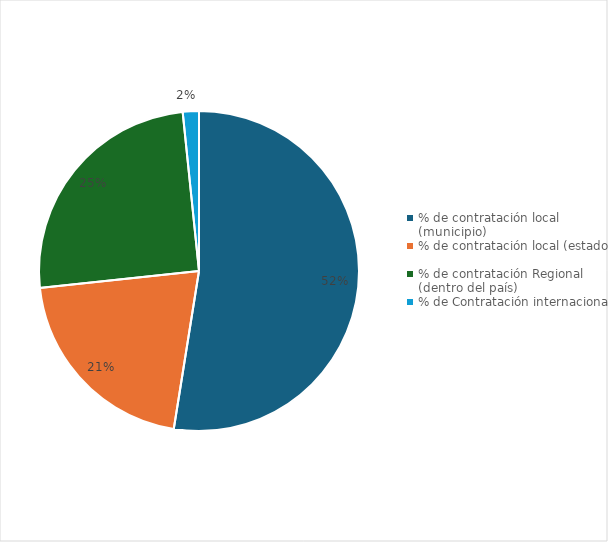
| Category | Series 0 |
|---|---|
| % de contratación local (municipio)  | 0.525 |
| % de contratación local (estado)  | 0.208 |
| % de contratación Regional (dentro del país)  | 0.251 |
| % de Contratación internacional | 0.016 |